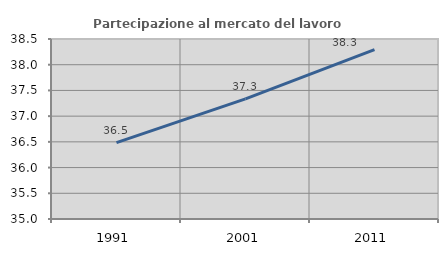
| Category | Partecipazione al mercato del lavoro  femminile |
|---|---|
| 1991.0 | 36.485 |
| 2001.0 | 37.335 |
| 2011.0 | 38.293 |